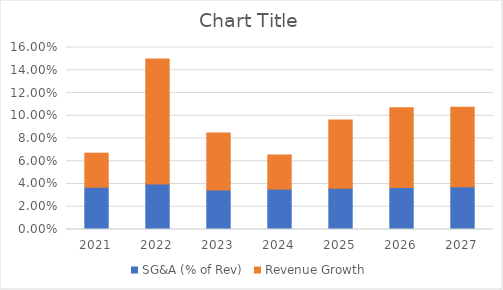
| Category | SG&A (% of Rev) | Revenue Growth |
|---|---|---|
| 2021.0 | 0.037 | 0.03 |
| 2022.0 | 0.04 | 0.11 |
| 2023.0 | 0.035 | 0.05 |
| 2024.0 | 0.036 | 0.03 |
| 2025.0 | 0.036 | 0.06 |
| 2026.0 | 0.037 | 0.07 |
| 2027.0 | 0.038 | 0.07 |